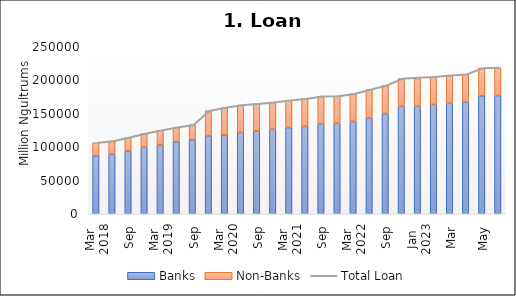
| Category | Banks | Non-Banks |
|---|---|---|
| 0 | 86839.062 | 19536.13 |
| 1 | 89492.789 | 19317.924 |
| 2 | 94257.106 | 19993.763 |
| 3 | 99542.627 | 20696.164 |
| 4 | 103455.022 | 21541.616 |
| 5 | 107823.786 | 21766.128 |
| 6 | 110793.514 | 22289.762 |
| 7 | 116541.685 | 37784.488 |
| 8 | 118433.441 | 40493.857 |
| 9 | 121831.338 | 40869.086 |
| 10 | 123947.936 | 40898.135 |
| 11 | 126363.799 | 40625.692 |
| 12 | 128951.639 | 40851.287 |
| 13 | 130897.833 | 41243.55 |
| 14 | 134359.87 | 41428.68 |
| 15 | 135415.887 | 40793.4 |
| 16 | 138284.661 | 41288.566 |
| 17 | 143532.338 | 42375.24 |
| 18 | 149966.968 | 41992.436 |
| 19 | 160873.72 | 41509.575 |
| 20 | 160873.72 | 41509.575 |
| 21 | 163784.222 | 41233.942 |
| 22 | 165428.061 | 41861.82 |
| 23 | 167303.912 | 41496.685 |
| 24 | 176700.108 | 41607.518 |
| 25 | 176977.708 | 41819.738 |